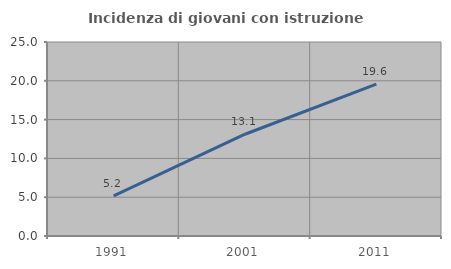
| Category | Incidenza di giovani con istruzione universitaria |
|---|---|
| 1991.0 | 5.172 |
| 2001.0 | 13.115 |
| 2011.0 | 19.58 |